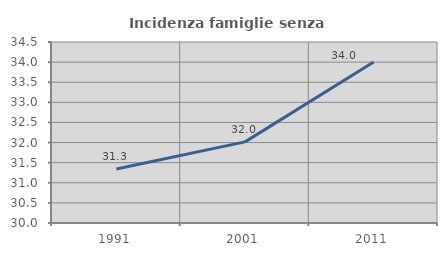
| Category | Incidenza famiglie senza nuclei |
|---|---|
| 1991.0 | 31.341 |
| 2001.0 | 32.016 |
| 2011.0 | 34.003 |